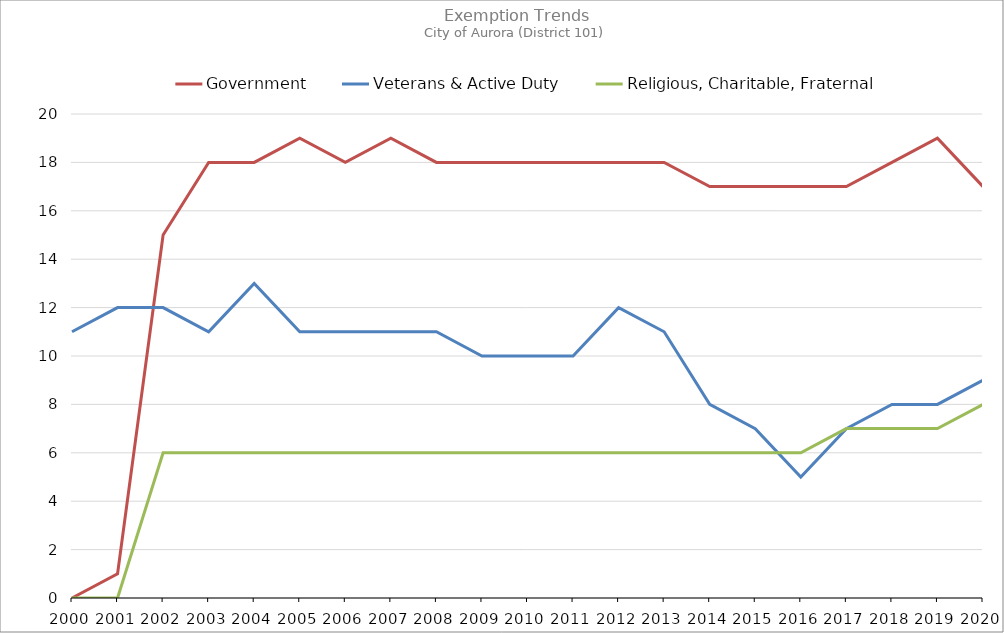
| Category | Government | Veterans & Active Duty | Religious, Charitable, Fraternal |
|---|---|---|---|
| 2000.0 | 0 | 11 | 0 |
| 2001.0 | 1 | 12 | 0 |
| 2002.0 | 15 | 12 | 6 |
| 2003.0 | 18 | 11 | 6 |
| 2004.0 | 18 | 13 | 6 |
| 2005.0 | 19 | 11 | 6 |
| 2006.0 | 18 | 11 | 6 |
| 2007.0 | 19 | 11 | 6 |
| 2008.0 | 18 | 11 | 6 |
| 2009.0 | 18 | 10 | 6 |
| 2010.0 | 18 | 10 | 6 |
| 2011.0 | 18 | 10 | 6 |
| 2012.0 | 18 | 12 | 6 |
| 2013.0 | 18 | 11 | 6 |
| 2014.0 | 17 | 8 | 6 |
| 2015.0 | 17 | 7 | 6 |
| 2016.0 | 17 | 5 | 6 |
| 2017.0 | 17 | 7 | 7 |
| 2018.0 | 18 | 8 | 7 |
| 2019.0 | 19 | 8 | 7 |
| 2020.0 | 17 | 9 | 8 |